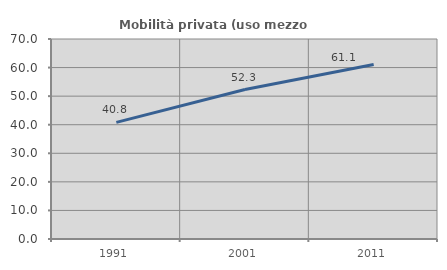
| Category | Mobilità privata (uso mezzo privato) |
|---|---|
| 1991.0 | 40.816 |
| 2001.0 | 52.308 |
| 2011.0 | 61.055 |